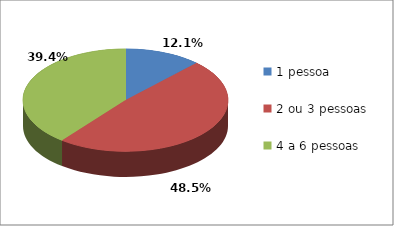
| Category | Series 0 |
|---|---|
| 1 pessoa | 4 |
| 2 ou 3 pessoas | 16 |
| 4 a 6 pessoas | 13 |